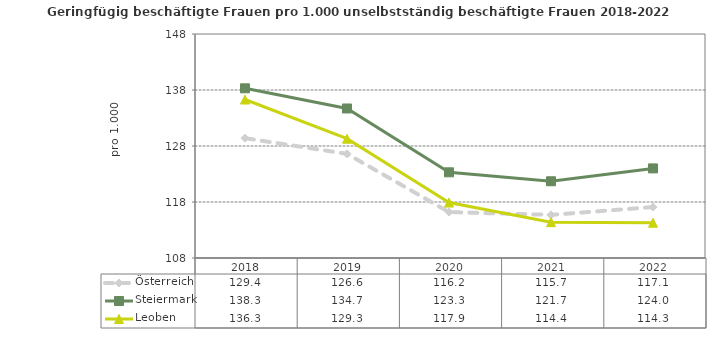
| Category | Österreich | Steiermark | Leoben |
|---|---|---|---|
| 2022.0 | 117.1 | 124 | 114.3 |
| 2021.0 | 115.7 | 121.7 | 114.4 |
| 2020.0 | 116.2 | 123.3 | 117.9 |
| 2019.0 | 126.6 | 134.7 | 129.3 |
| 2018.0 | 129.4 | 138.3 | 136.3 |